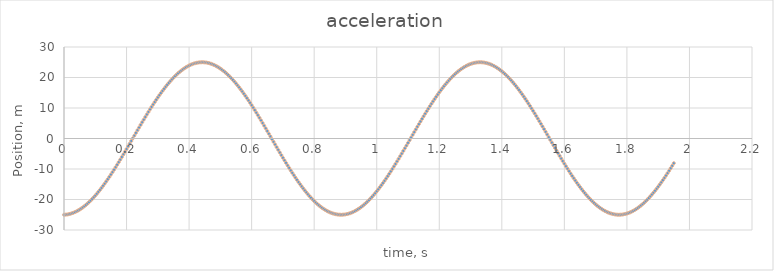
| Category | acceleration |
|---|---|
| 0.0 | -25 |
| 0.005 | -24.969 |
| 0.01 | -24.906 |
| 0.015 | -24.813 |
| 0.02 | -24.688 |
| 0.025 | -24.533 |
| 0.030000000000000002 | -24.346 |
| 0.035 | -24.13 |
| 0.04 | -23.883 |
| 0.045 | -23.607 |
| 0.049999999999999996 | -23.301 |
| 0.05499999999999999 | -22.965 |
| 0.05999999999999999 | -22.601 |
| 0.06499999999999999 | -22.209 |
| 0.06999999999999999 | -21.789 |
| 0.075 | -21.342 |
| 0.08 | -20.868 |
| 0.085 | -20.368 |
| 0.09000000000000001 | -19.843 |
| 0.09500000000000001 | -19.293 |
| 0.10000000000000002 | -18.718 |
| 0.10500000000000002 | -18.121 |
| 0.11000000000000003 | -17.5 |
| 0.11500000000000003 | -16.858 |
| 0.12000000000000004 | -16.195 |
| 0.12500000000000003 | -15.511 |
| 0.13000000000000003 | -14.808 |
| 0.13500000000000004 | -14.087 |
| 0.14000000000000004 | -13.348 |
| 0.14500000000000005 | -12.592 |
| 0.15000000000000005 | -11.82 |
| 0.15500000000000005 | -11.034 |
| 0.16000000000000006 | -10.234 |
| 0.16500000000000006 | -9.421 |
| 0.17000000000000007 | -8.597 |
| 0.17500000000000007 | -7.761 |
| 0.18000000000000008 | -6.916 |
| 0.18500000000000008 | -6.062 |
| 0.19000000000000009 | -5.201 |
| 0.1950000000000001 | -4.333 |
| 0.2000000000000001 | -3.46 |
| 0.2050000000000001 | -2.583 |
| 0.2100000000000001 | -1.702 |
| 0.2150000000000001 | -0.819 |
| 0.2200000000000001 | 0.065 |
| 0.22500000000000012 | 0.949 |
| 0.23000000000000012 | 1.831 |
| 0.23500000000000013 | 2.712 |
| 0.24000000000000013 | 3.589 |
| 0.24500000000000013 | 4.461 |
| 0.2500000000000001 | 5.328 |
| 0.2550000000000001 | 6.188 |
| 0.2600000000000001 | 7.041 |
| 0.2650000000000001 | 7.885 |
| 0.27000000000000013 | 8.719 |
| 0.27500000000000013 | 9.542 |
| 0.28000000000000014 | 10.353 |
| 0.28500000000000014 | 11.151 |
| 0.29000000000000015 | 11.935 |
| 0.29500000000000015 | 12.704 |
| 0.30000000000000016 | 13.457 |
| 0.30500000000000016 | 14.194 |
| 0.31000000000000016 | 14.913 |
| 0.31500000000000017 | 15.613 |
| 0.3200000000000002 | 16.293 |
| 0.3250000000000002 | 16.954 |
| 0.3300000000000002 | 17.593 |
| 0.3350000000000002 | 18.21 |
| 0.3400000000000002 | 18.804 |
| 0.3450000000000002 | 19.375 |
| 0.3500000000000002 | 19.922 |
| 0.3550000000000002 | 20.443 |
| 0.3600000000000002 | 20.94 |
| 0.3650000000000002 | 21.409 |
| 0.3700000000000002 | 21.853 |
| 0.3750000000000002 | 22.269 |
| 0.3800000000000002 | 22.657 |
| 0.38500000000000023 | 23.016 |
| 0.39000000000000024 | 23.347 |
| 0.39500000000000024 | 23.649 |
| 0.40000000000000024 | 23.921 |
| 0.40500000000000025 | 24.164 |
| 0.41000000000000025 | 24.376 |
| 0.41500000000000026 | 24.557 |
| 0.42000000000000026 | 24.708 |
| 0.42500000000000027 | 24.828 |
| 0.43000000000000027 | 24.917 |
| 0.4350000000000003 | 24.975 |
| 0.4400000000000003 | 25.002 |
| 0.4450000000000003 | 24.997 |
| 0.4500000000000003 | 24.962 |
| 0.4550000000000003 | 24.894 |
| 0.4600000000000003 | 24.796 |
| 0.4650000000000003 | 24.667 |
| 0.4700000000000003 | 24.507 |
| 0.4750000000000003 | 24.317 |
| 0.4800000000000003 | 24.096 |
| 0.4850000000000003 | 23.844 |
| 0.4900000000000003 | 23.563 |
| 0.49500000000000033 | 23.253 |
| 0.5000000000000003 | 22.914 |
| 0.5050000000000003 | 22.545 |
| 0.5100000000000003 | 22.149 |
| 0.5150000000000003 | 21.725 |
| 0.5200000000000004 | 21.274 |
| 0.5250000000000004 | 20.796 |
| 0.5300000000000004 | 20.293 |
| 0.5350000000000004 | 19.764 |
| 0.5400000000000004 | 19.21 |
| 0.5450000000000004 | 18.632 |
| 0.5500000000000004 | 18.031 |
| 0.5550000000000004 | 17.407 |
| 0.5600000000000004 | 16.762 |
| 0.5650000000000004 | 16.096 |
| 0.5700000000000004 | 15.409 |
| 0.5750000000000004 | 14.703 |
| 0.5800000000000004 | 13.979 |
| 0.5850000000000004 | 13.238 |
| 0.5900000000000004 | 12.48 |
| 0.5950000000000004 | 11.706 |
| 0.6000000000000004 | 10.917 |
| 0.6050000000000004 | 10.115 |
| 0.6100000000000004 | 9.301 |
| 0.6150000000000004 | 8.475 |
| 0.6200000000000004 | 7.638 |
| 0.6250000000000004 | 6.791 |
| 0.6300000000000004 | 5.936 |
| 0.6350000000000005 | 5.074 |
| 0.6400000000000005 | 4.205 |
| 0.6450000000000005 | 3.331 |
| 0.6500000000000005 | 2.453 |
| 0.6550000000000005 | 1.572 |
| 0.6600000000000005 | 0.689 |
| 0.6650000000000005 | -0.195 |
| 0.6700000000000005 | -1.079 |
| 0.6750000000000005 | -1.961 |
| 0.6800000000000005 | -2.841 |
| 0.6850000000000005 | -3.717 |
| 0.6900000000000005 | -4.589 |
| 0.6950000000000005 | -5.455 |
| 0.7000000000000005 | -6.314 |
| 0.7050000000000005 | -7.166 |
| 0.7100000000000005 | -8.008 |
| 0.7150000000000005 | -8.84 |
| 0.7200000000000005 | -9.661 |
| 0.7250000000000005 | -10.471 |
| 0.7300000000000005 | -11.267 |
| 0.7350000000000005 | -12.049 |
| 0.7400000000000005 | -12.816 |
| 0.7450000000000006 | -13.567 |
| 0.7500000000000006 | -14.301 |
| 0.7550000000000006 | -15.017 |
| 0.7600000000000006 | -15.714 |
| 0.7650000000000006 | -16.392 |
| 0.7700000000000006 | -17.049 |
| 0.7750000000000006 | -17.685 |
| 0.7800000000000006 | -18.299 |
| 0.7850000000000006 | -18.89 |
| 0.7900000000000006 | -19.457 |
| 0.7950000000000006 | -20 |
| 0.8000000000000006 | -20.518 |
| 0.8050000000000006 | -21.01 |
| 0.8100000000000006 | -21.476 |
| 0.8150000000000006 | -21.916 |
| 0.8200000000000006 | -22.327 |
| 0.8250000000000006 | -22.711 |
| 0.8300000000000006 | -23.067 |
| 0.8350000000000006 | -23.394 |
| 0.8400000000000006 | -23.691 |
| 0.8450000000000006 | -23.959 |
| 0.8500000000000006 | -24.197 |
| 0.8550000000000006 | -24.404 |
| 0.8600000000000007 | -24.582 |
| 0.8650000000000007 | -24.728 |
| 0.8700000000000007 | -24.843 |
| 0.8750000000000007 | -24.928 |
| 0.8800000000000007 | -24.981 |
| 0.8850000000000007 | -25.003 |
| 0.8900000000000007 | -24.994 |
| 0.8950000000000007 | -24.954 |
| 0.9000000000000007 | -24.882 |
| 0.9050000000000007 | -24.779 |
| 0.9100000000000007 | -24.646 |
| 0.9150000000000007 | -24.481 |
| 0.9200000000000007 | -24.286 |
| 0.9250000000000007 | -24.061 |
| 0.9300000000000007 | -23.805 |
| 0.9350000000000007 | -23.52 |
| 0.9400000000000007 | -23.205 |
| 0.9450000000000007 | -22.861 |
| 0.9500000000000007 | -22.489 |
| 0.9550000000000007 | -22.089 |
| 0.9600000000000007 | -21.661 |
| 0.9650000000000007 | -21.206 |
| 0.9700000000000008 | -20.724 |
| 0.9750000000000008 | -20.216 |
| 0.9800000000000008 | -19.684 |
| 0.9850000000000008 | -19.126 |
| 0.9900000000000008 | -18.545 |
| 0.9950000000000008 | -17.941 |
| 1.0000000000000007 | -17.314 |
| 1.0050000000000006 | -16.665 |
| 1.0100000000000005 | -15.996 |
| 1.0150000000000003 | -15.307 |
| 1.0200000000000002 | -14.598 |
| 1.0250000000000001 | -13.871 |
| 1.03 | -13.127 |
| 1.035 | -12.367 |
| 1.0399999999999998 | -11.591 |
| 1.0449999999999997 | -10.8 |
| 1.0499999999999996 | -9.996 |
| 1.0549999999999995 | -9.18 |
| 1.0599999999999994 | -8.352 |
| 1.0649999999999993 | -7.514 |
| 1.0699999999999992 | -6.666 |
| 1.074999999999999 | -5.81 |
| 1.079999999999999 | -4.947 |
| 1.0849999999999989 | -4.077 |
| 1.0899999999999987 | -3.203 |
| 1.0949999999999986 | -2.324 |
| 1.0999999999999985 | -1.443 |
| 1.1049999999999984 | -0.559 |
| 1.1099999999999983 | 0.325 |
| 1.1149999999999982 | 1.208 |
| 1.119999999999998 | 2.091 |
| 1.124999999999998 | 2.97 |
| 1.129999999999998 | 3.846 |
| 1.1349999999999978 | 4.717 |
| 1.1399999999999977 | 5.582 |
| 1.1449999999999976 | 6.44 |
| 1.1499999999999975 | 7.29 |
| 1.1549999999999974 | 8.131 |
| 1.1599999999999973 | 8.962 |
| 1.1649999999999971 | 9.781 |
| 1.169999999999997 | 10.589 |
| 1.174999999999997 | 11.383 |
| 1.1799999999999968 | 12.162 |
| 1.1849999999999967 | 12.927 |
| 1.1899999999999966 | 13.676 |
| 1.1949999999999965 | 14.407 |
| 1.1999999999999964 | 15.12 |
| 1.2049999999999963 | 15.815 |
| 1.2099999999999962 | 16.49 |
| 1.214999999999996 | 17.144 |
| 1.219999999999996 | 17.777 |
| 1.2249999999999959 | 18.387 |
| 1.2299999999999958 | 18.975 |
| 1.2349999999999957 | 19.538 |
| 1.2399999999999956 | 20.078 |
| 1.2449999999999954 | 20.592 |
| 1.2499999999999953 | 21.08 |
| 1.2549999999999952 | 21.543 |
| 1.2599999999999951 | 21.978 |
| 1.264999999999995 | 22.386 |
| 1.269999999999995 | 22.765 |
| 1.2749999999999948 | 23.117 |
| 1.2799999999999947 | 23.439 |
| 1.2849999999999946 | 23.732 |
| 1.2899999999999945 | 23.996 |
| 1.2949999999999944 | 24.229 |
| 1.2999999999999943 | 24.432 |
| 1.3049999999999942 | 24.605 |
| 1.309999999999994 | 24.747 |
| 1.314999999999994 | 24.858 |
| 1.3199999999999938 | 24.938 |
| 1.3249999999999937 | 24.986 |
| 1.3299999999999936 | 25.004 |
| 1.3349999999999935 | 24.99 |
| 1.3399999999999934 | 24.945 |
| 1.3449999999999933 | 24.869 |
| 1.3499999999999932 | 24.762 |
| 1.354999999999993 | 24.623 |
| 1.359999999999993 | 24.454 |
| 1.3649999999999929 | 24.255 |
| 1.3699999999999928 | 24.025 |
| 1.3749999999999927 | 23.765 |
| 1.3799999999999926 | 23.475 |
| 1.3849999999999925 | 23.156 |
| 1.3899999999999924 | 22.808 |
| 1.3949999999999922 | 22.432 |
| 1.3999999999999921 | 22.027 |
| 1.404999999999992 | 21.595 |
| 1.409999999999992 | 21.136 |
| 1.4149999999999918 | 20.651 |
| 1.4199999999999917 | 20.14 |
| 1.4249999999999916 | 19.603 |
| 1.4299999999999915 | 19.042 |
| 1.4349999999999914 | 18.458 |
| 1.4399999999999913 | 17.85 |
| 1.4449999999999912 | 17.22 |
| 1.449999999999991 | 16.568 |
| 1.454999999999991 | 15.896 |
| 1.4599999999999909 | 15.204 |
| 1.4649999999999908 | 14.492 |
| 1.4699999999999906 | 13.763 |
| 1.4749999999999905 | 13.016 |
| 1.4799999999999904 | 12.254 |
| 1.4849999999999903 | 11.476 |
| 1.4899999999999902 | 10.683 |
| 1.4949999999999901 | 9.877 |
| 1.49999999999999 | 9.059 |
| 1.50499999999999 | 8.23 |
| 1.5099999999999898 | 7.39 |
| 1.5149999999999897 | 6.541 |
| 1.5199999999999896 | 5.684 |
| 1.5249999999999895 | 4.819 |
| 1.5299999999999894 | 3.949 |
| 1.5349999999999893 | 3.074 |
| 1.5399999999999892 | 2.195 |
| 1.544999999999989 | 1.313 |
| 1.549999999999989 | 0.429 |
| 1.5549999999999888 | -0.455 |
| 1.5599999999999887 | -1.338 |
| 1.5649999999999886 | -2.22 |
| 1.5699999999999885 | -3.099 |
| 1.5749999999999884 | -3.974 |
| 1.5799999999999883 | -4.844 |
| 1.5849999999999882 | -5.708 |
| 1.589999999999988 | -6.565 |
| 1.594999999999988 | -7.414 |
| 1.5999999999999879 | -8.254 |
| 1.6049999999999878 | -9.083 |
| 1.6099999999999877 | -9.901 |
| 1.6149999999999876 | -10.706 |
| 1.6199999999999875 | -11.498 |
| 1.6249999999999873 | -12.276 |
| 1.6299999999999872 | -13.038 |
| 1.6349999999999871 | -13.784 |
| 1.639999999999987 | -14.513 |
| 1.644999999999987 | -15.224 |
| 1.6499999999999868 | -15.915 |
| 1.6549999999999867 | -16.587 |
| 1.6599999999999866 | -17.238 |
| 1.6649999999999865 | -17.868 |
| 1.6699999999999864 | -18.475 |
| 1.6749999999999863 | -19.059 |
| 1.6799999999999862 | -19.619 |
| 1.684999999999986 | -20.155 |
| 1.689999999999986 | -20.665 |
| 1.6949999999999859 | -21.15 |
| 1.6999999999999857 | -21.608 |
| 1.7049999999999856 | -22.039 |
| 1.7099999999999855 | -22.443 |
| 1.7149999999999854 | -22.819 |
| 1.7199999999999853 | -23.166 |
| 1.7249999999999852 | -23.484 |
| 1.729999999999985 | -23.773 |
| 1.734999999999985 | -24.032 |
| 1.739999999999985 | -24.261 |
| 1.7449999999999848 | -24.46 |
| 1.7499999999999847 | -24.628 |
| 1.7549999999999846 | -24.765 |
| 1.7599999999999845 | -24.871 |
| 1.7649999999999844 | -24.947 |
| 1.7699999999999843 | -24.991 |
| 1.7749999999999841 | -25.004 |
| 1.779999999999984 | -24.985 |
| 1.784999999999984 | -24.936 |
| 1.7899999999999838 | -24.855 |
| 1.7949999999999837 | -24.743 |
| 1.7999999999999836 | -24.6 |
| 1.8049999999999835 | -24.427 |
| 1.8099999999999834 | -24.223 |
| 1.8149999999999833 | -23.988 |
| 1.8199999999999832 | -23.724 |
| 1.824999999999983 | -23.43 |
| 1.829999999999983 | -23.107 |
| 1.8349999999999829 | -22.755 |
| 1.8399999999999828 | -22.374 |
| 1.8449999999999827 | -21.966 |
| 1.8499999999999825 | -21.53 |
| 1.8549999999999824 | -21.067 |
| 1.8599999999999823 | -20.577 |
| 1.8649999999999822 | -20.062 |
| 1.8699999999999821 | -19.522 |
| 1.874999999999982 | -18.958 |
| 1.879999999999982 | -18.37 |
| 1.8849999999999818 | -17.759 |
| 1.8899999999999817 | -17.125 |
| 1.8949999999999816 | -16.471 |
| 1.8999999999999815 | -15.795 |
| 1.9049999999999814 | -15.1 |
| 1.9099999999999813 | -14.386 |
| 1.9149999999999812 | -13.654 |
| 1.919999999999981 | -12.905 |
| 1.924999999999981 | -12.14 |
| 1.9299999999999808 | -11.36 |
| 1.9349999999999807 | -10.565 |
| 1.9399999999999806 | -9.758 |
| 1.9449999999999805 | -8.938 |
| 1.9499999999999804 | -8.107 |